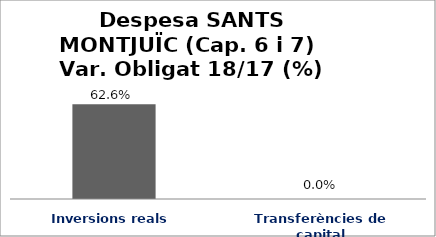
| Category | Series 0 |
|---|---|
| Inversions reals | 0.626 |
| Transferències de capital | 0 |